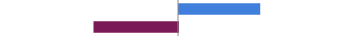
| Category | Series 0 |
|---|---|
| Favorable | 0.459 |
| Unfavorable | -0.477 |